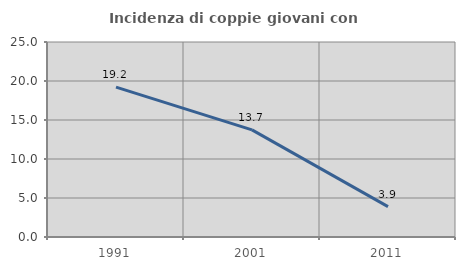
| Category | Incidenza di coppie giovani con figli |
|---|---|
| 1991.0 | 19.211 |
| 2001.0 | 13.731 |
| 2011.0 | 3.889 |